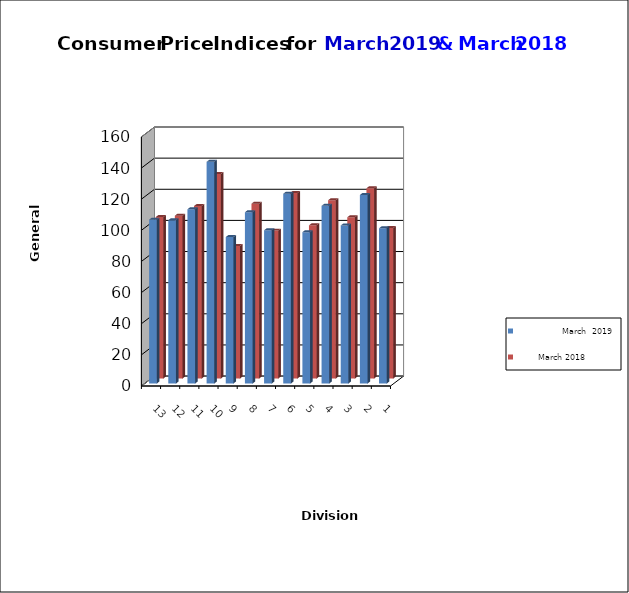
| Category |                March  2019 |        March 2018 |
|---|---|---|
| 0 | 99.7 | 96.7 |
| 1 | 121.1 | 122.2 |
| 2 | 101.5 | 103.6 |
| 3 | 114.1 | 114.5 |
| 4 | 97.2 | 98.4 |
| 5 | 121.9 | 119.1 |
| 6 | 98.4 | 95 |
| 7 | 110 | 112.3 |
| 8 | 94.1 | 85.1 |
| 9 | 142.4 | 131.4 |
| 10 | 111.9 | 110.8 |
| 11 | 104.9 | 104.6 |
| 12 | 105.2 | 103.7 |